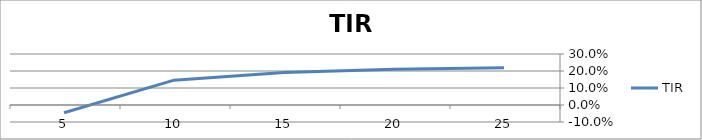
| Category | TIR |
|---|---|
| 25.0 | 0.219 |
| 20.0 | 0.21 |
| 15.0 | 0.19 |
| 10.0 | 0.146 |
| 5.0 | -0.046 |